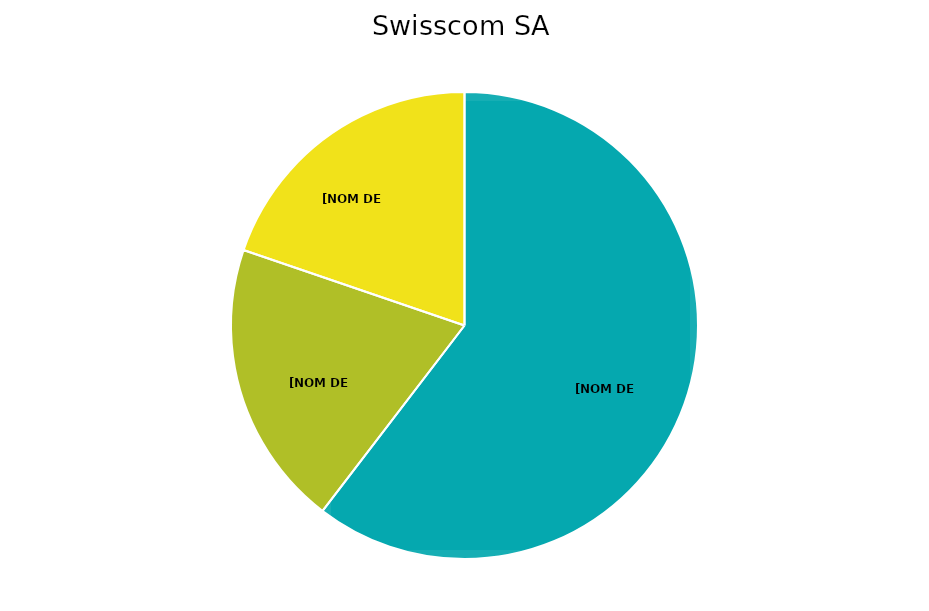
| Category | Series 0 |
|---|---|
| Swisscom SA | 0.493 |
| UPC sàrl | 0.162 |
| Sunrise Communications SA | 0.161 |